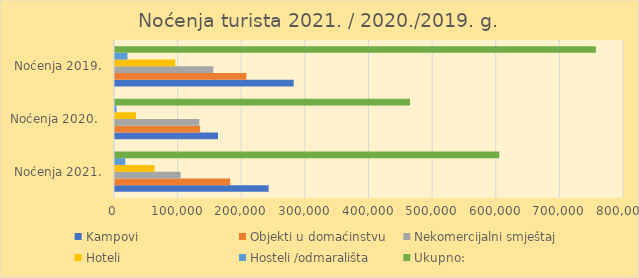
| Category | Kampovi | Objekti u domaćinstvu | Nekomercijalni smještaj | Hoteli | Hosteli /odmarališta | Ukupno: |
|---|---|---|---|---|---|---|
| Noćenja 2021. | 241513 | 181027 | 103161 | 62142 | 16107 | 603950 |
| Noćenja 2020.  | 161867 | 133742 | 132534 | 33066 | 2520 | 463729 |
| Noćenja 2019. | 280817 | 206343 | 154380 | 94667 | 19603 | 755810 |